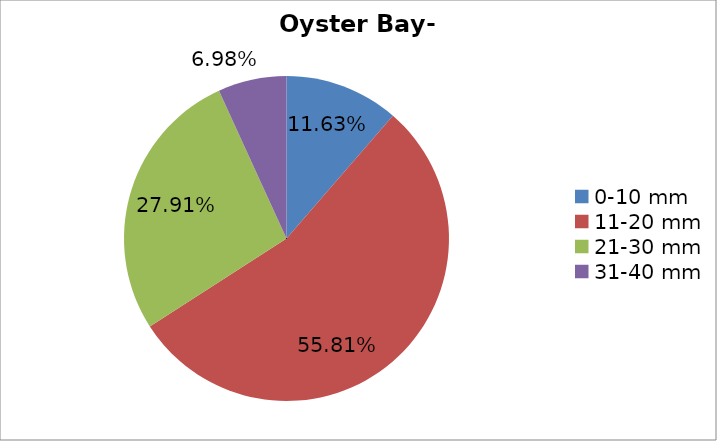
| Category | Series 0 |
|---|---|
| 0-10 mm | 0.116 |
| 11-20 mm | 0.558 |
| 21-30 mm | 0.279 |
| 31-40 mm | 0.07 |